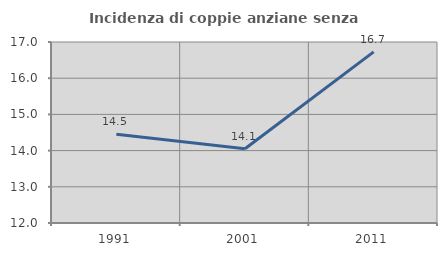
| Category | Incidenza di coppie anziane senza figli  |
|---|---|
| 1991.0 | 14.454 |
| 2001.0 | 14.052 |
| 2011.0 | 16.727 |